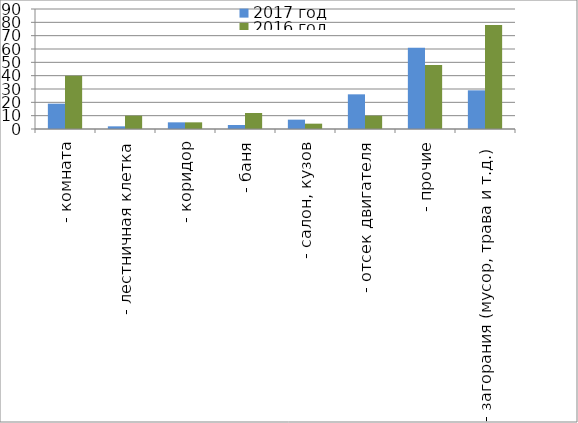
| Category | 2017 год | 2016 год |
|---|---|---|
|  - комната | 19 | 40 |
|  - лестничная клетка | 2 | 10 |
|  - коридор | 5 | 5 |
|  - баня | 3 | 12 |
|  - салон, кузов | 7 | 4 |
|  - отсек двигателя | 26 | 10 |
| - прочие | 61 | 48 |
| - загорания (мусор, трава и т.д.)  | 29 | 78 |